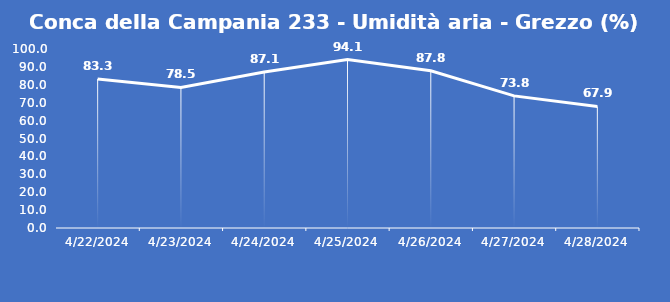
| Category | Conca della Campania 233 - Umidità aria - Grezzo (%) |
|---|---|
| 4/22/24 | 83.3 |
| 4/23/24 | 78.5 |
| 4/24/24 | 87.1 |
| 4/25/24 | 94.1 |
| 4/26/24 | 87.8 |
| 4/27/24 | 73.8 |
| 4/28/24 | 67.9 |